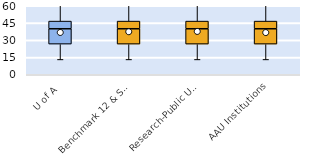
| Category | 25th | 50th | 75th |
|---|---|---|---|
| U of A | 26.667 | 13.333 | 6.667 |
| Benchmark 12 & SEC | 26.667 | 13.333 | 6.667 |
| Research-Public Univ | 26.667 | 13.333 | 6.667 |
| AAU Institutions | 26.667 | 13.333 | 6.667 |